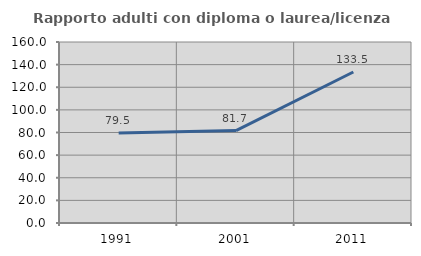
| Category | Rapporto adulti con diploma o laurea/licenza media  |
|---|---|
| 1991.0 | 79.487 |
| 2001.0 | 81.702 |
| 2011.0 | 133.491 |